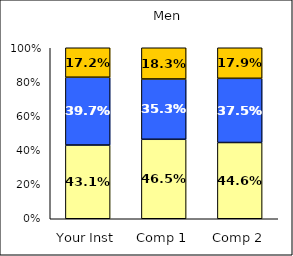
| Category | Low UG Ed Goal: Personal Development | Average UG Ed Goal: Personal Development | High UG Ed Goal: Personal Development |
|---|---|---|---|
| Your Inst | 0.431 | 0.397 | 0.172 |
| Comp 1 | 0.465 | 0.353 | 0.183 |
| Comp 2 | 0.446 | 0.375 | 0.179 |